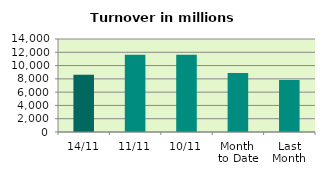
| Category | Series 0 |
|---|---|
| 14/11 | 8621.185 |
| 11/11 | 11641.433 |
| 10/11 | 11625.454 |
| Month 
to Date | 8865.376 |
| Last
Month | 7813.06 |